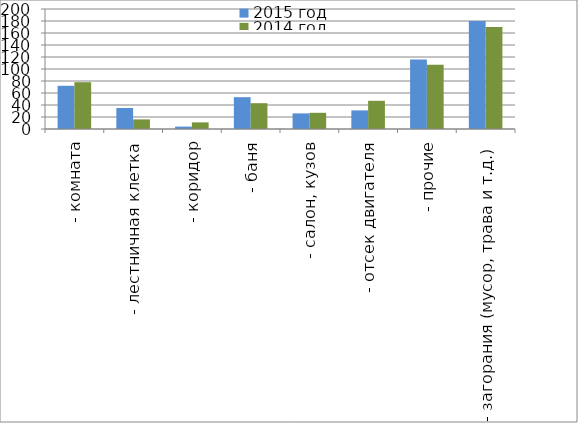
| Category | 2015 год | 2014 год |
|---|---|---|
|  - комната | 72 | 78 |
|  - лестничная клетка | 35 | 16 |
|  - коридор | 4 | 11 |
|  - баня | 53 | 43 |
|  - салон, кузов | 26 | 27 |
|  - отсек двигателя | 31 | 47 |
| - прочие | 116 | 107 |
| - загорания (мусор, трава и т.д.)  | 180 | 170 |